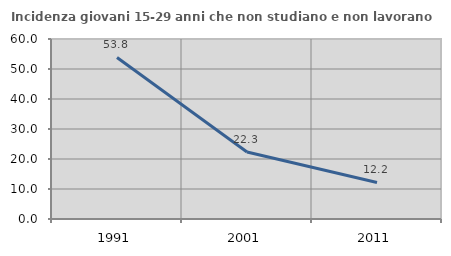
| Category | Incidenza giovani 15-29 anni che non studiano e non lavorano  |
|---|---|
| 1991.0 | 53.846 |
| 2001.0 | 22.33 |
| 2011.0 | 12.195 |